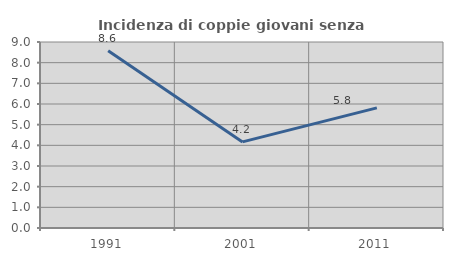
| Category | Incidenza di coppie giovani senza figli |
|---|---|
| 1991.0 | 8.571 |
| 2001.0 | 4.167 |
| 2011.0 | 5.814 |